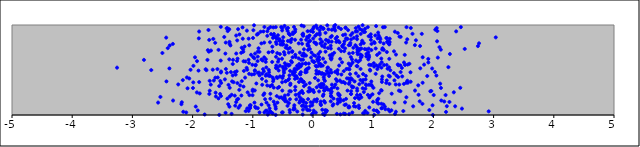
| Category | points |
|---|---|
| 0.7105808632542185 | 0.966 |
| 2.2096744670275097 | 0.034 |
| 0.8415705962671867 | 0.922 |
| 0.407575068377791 | 0.127 |
| 0.1228081273992725 | 0.796 |
| 2.0736347849311088 | 0.638 |
| -0.5068877766610775 | 0.411 |
| -0.4985774278265369 | 0.821 |
| 0.44746918099802 | 0.183 |
| -2.808056882615082 | 0.613 |
| -1.048196033948357 | 0.103 |
| -0.297892421039716 | 0.926 |
| 0.06457462356183985 | 0.898 |
| 2.1230010343279275 | 0.726 |
| -0.9945306396990601 | 0.643 |
| 0.12814866126633806 | 0.979 |
| 0.6297166063317885 | 0.408 |
| -0.5497564237603756 | 0.428 |
| -0.4294087979343857 | 0.148 |
| -0.9731424836548541 | 0.63 |
| -1.2241000954857322 | 0.279 |
| 0.8741937935506154 | 0.395 |
| 0.5419325343704067 | 0.97 |
| -0.6068019779133884 | 0.789 |
| -1.2372229060851998 | 0.081 |
| 1.5678409285535473 | 0.381 |
| 0.7554223387812264 | 0.982 |
| 0.12038748257253218 | 0.702 |
| 0.21489755094719953 | 0.835 |
| 2.757998663448886 | 0.796 |
| -0.45541394580504946 | 0.55 |
| -0.9628500671047702 | 0.682 |
| -0.8239742672561556 | 0.222 |
| -1.539231722912354 | 0.378 |
| -1.319562399824643 | 0.365 |
| 0.20331742074876935 | 0.585 |
| -0.658912145064475 | 0.882 |
| 0.7822898753321175 | 0.731 |
| 0.6819714468313283 | 0.133 |
| 2.054527766417177 | 0.966 |
| -0.7742593381208573 | 0.452 |
| -0.5285851522845935 | 0.196 |
| 0.572870187432553 | 0.845 |
| 1.0991821196682956 | 0.242 |
| -0.11249477900595117 | 0.836 |
| -0.45435411380895374 | 0.377 |
| -1.7159726756758262 | 0.38 |
| -1.4556738507315252 | 0.682 |
| -2.686668835990161 | 0.499 |
| -0.36947547169349537 | 0.809 |
| 0.07771573484048222 | 0.598 |
| -1.4312884535078876 | 0.469 |
| 2.739468916265265 | 0.765 |
| 0.31039236066081966 | 0.815 |
| 0.040040816694386194 | 0.656 |
| -0.09696543576297856 | 0.867 |
| -0.681502159267275 | 0.333 |
| 1.057466917246776 | 0.048 |
| -1.881143054977609 | 0.24 |
| 1.0843748063808034 | 0.03 |
| -0.48463494457880696 | 0.49 |
| 0.8865273041192943 | 0.331 |
| -0.4118252182353075 | 0.227 |
| 1.7099061604410952 | 0.83 |
| 1.0093698911087277 | 0.054 |
| 1.8221788910680505 | 0.641 |
| -1.0184063009123268 | 0.45 |
| -0.18457458651053926 | 0.267 |
| -0.5126539298469117 | 0.94 |
| -1.0474452097846498 | 0.075 |
| 0.7337658028655065 | 0.269 |
| -0.822921130110287 | 0.928 |
| 0.15382430478275744 | 0.464 |
| -0.3822086203293633 | 0.175 |
| 0.10123614058880026 | 0.262 |
| -0.6647660679820468 | 0.858 |
| 0.11236196335986737 | 0.892 |
| -0.43707405122674725 | 0.96 |
| -1.9284061512206012 | 0.251 |
| 0.29361547471216554 | 0.771 |
| 0.6588177998740896 | 0.583 |
| -0.17680733375787838 | 0.372 |
| 1.6523976967900884 | 0.902 |
| 0.8678221013794234 | 0.046 |
| -1.363745131028545 | 0.476 |
| 0.059534277338482156 | 0.151 |
| 0.22566785664970812 | 0.049 |
| -0.7853294539065621 | 0.589 |
| 0.41792314980626344 | 0.238 |
| -1.3330364546751845 | 0.44 |
| 0.5998872591558193 | 0.01 |
| 1.2652192908034259 | 0.79 |
| 1.4764671549466062 | 0.523 |
| -0.590365458336616 | 0.527 |
| -0.42201337102038927 | 0.934 |
| 0.42476716648593804 | 0.973 |
| -0.9129970429125072 | 0.903 |
| -0.061012871594633644 | 0.301 |
| -0.06862385595912635 | 0.814 |
| -0.7403556130976225 | 0.437 |
| -1.5323936813954742 | 0.605 |
| 0.4645892882494067 | 0.955 |
| 0.8236493422986744 | 0.362 |
| -0.6033711161183977 | 0.421 |
| 0.6175103957569341 | 0.778 |
| 1.248639141951971 | 0.817 |
| 1.0745891104235437 | 0.851 |
| 0.46797094988591414 | 0.709 |
| -1.5566352381286706 | 0.001 |
| -0.17493236087110642 | 0.568 |
| -0.2939239040033863 | 0.313 |
| 1.5535628914384159 | 0.976 |
| 0.870275262712453 | 0.293 |
| 0.5410844673982753 | 0.968 |
| -0.590695514644695 | 0.411 |
| 0.18773369565356912 | 0.271 |
| -0.7086245188123321 | 0.181 |
| -1.2446019502264907 | 0.953 |
| -1.3844428528006913 | 0.789 |
| 0.9974011066910595 | 0.147 |
| 0.1111427862533656 | 0.91 |
| 1.9328668452237352 | 0.055 |
| 0.8235721554840749 | 0.998 |
| -1.5425940614056808 | 0.234 |
| -0.9667754567801472 | 0.273 |
| 0.44109499144592057 | 0.806 |
| -0.157670575814703 | 0.144 |
| -0.48220025825955926 | 0.698 |
| -0.08891032440981839 | 0.931 |
| 2.474382716192027 | 0.071 |
| 0.2449414201134834 | 0.283 |
| -0.4177932840524079 | 0.736 |
| -0.09078664868065545 | 0.789 |
| -0.7140807739248647 | 0.435 |
| 1.5006666111850482 | 0.044 |
| 0.3023668775826023 | 0.618 |
| 0.7883252648431229 | 0.673 |
| 0.546903067037122 | 0.849 |
| -0.8374014221623263 | 0.605 |
| -0.032191361618910896 | 0.638 |
| -0.6580996965406607 | 0.973 |
| -0.052448687161949614 | 0.734 |
| -0.15626839020433891 | 0.684 |
| 2.065441943904908 | 0.933 |
| -0.07611563943256616 | 0.861 |
| 0.7311617540089088 | 0.223 |
| -0.6135633507591782 | 0.811 |
| 0.5561196086501319 | 0.511 |
| -0.8563289574069985 | 0.617 |
| 0.014604038165694888 | 0.254 |
| -1.5314986475289531 | 0.979 |
| 0.18371427590360057 | 0.453 |
| 0.48636167755235427 | 0.769 |
| 1.0839396381877817 | 0.18 |
| 1.0611503391977788 | 0.045 |
| 0.20434169768797528 | 0.452 |
| -0.41529239088869296 | 0.967 |
| -0.0557465021584882 | 0.054 |
| 0.5914329515735304 | 0.084 |
| -0.29394954037426846 | 0.95 |
| -1.0452994855732252 | 0.077 |
| -1.0701240603360729 | 0.045 |
| 0.8648762511030466 | 0.959 |
| -0.23867357929119049 | 0.233 |
| -0.3840256376661957 | 0.029 |
| 0.7359435699619858 | 0.696 |
| 0.2928060712687808 | 0.865 |
| -0.7700820077706485 | 0.047 |
| 0.12601823555228098 | 0.123 |
| 0.6710648367866145 | 0.31 |
| 0.3767131658665015 | 0.85 |
| 2.031782747460186 | 0.948 |
| -1.3709513542859213 | 0.773 |
| 0.6030349446683028 | 0.086 |
| 0.4406095367805918 | 0.219 |
| -0.2681427183255245 | 0.511 |
| 0.9249513834595477 | 0.876 |
| -0.6712953740814989 | 0.417 |
| 1.3026693301200352 | 0.052 |
| -0.37453821635521756 | 0.349 |
| 0.3385238035673508 | 0.12 |
| -0.960916958511925 | 0.092 |
| -0.9048740448623214 | 0.741 |
| -0.1790546698259714 | 0.662 |
| -1.7832556350550046 | 0.509 |
| -0.5543253508487656 | 0.842 |
| -0.5902485445855641 | 0.138 |
| 0.6287245256002612 | 0.643 |
| 1.3785708790452977 | 0.672 |
| -0.19762303346581955 | 0.837 |
| 0.266817716065173 | 0.433 |
| 0.23707687342155292 | 0.996 |
| 0.4515812259767058 | 0.624 |
| 0.35133443457884717 | 0.986 |
| 0.7506376507841042 | 0.59 |
| 0.8024535209808938 | 0.738 |
| 0.18724473672402908 | 0.272 |
| -1.3838653841638227 | 0.302 |
| 0.9188500303140597 | 0.618 |
| 0.6479723122208725 | 0.617 |
| -0.16546728112164022 | 0.615 |
| 0.12865818600790924 | 0.324 |
| 0.2526726199776954 | 0.828 |
| 0.9325690137034872 | 0.558 |
| 1.009615945182409 | 0.575 |
| 1.528405149746602 | 0.556 |
| -0.30339612238599134 | 0.514 |
| 1.2572992195871997 | 0.437 |
| -0.9521464459386193 | 0.558 |
| -1.328105998304121 | 0.613 |
| -1.9262924028035089 | 0.598 |
| 1.1758622960423235 | 0.724 |
| 0.7677091687741511 | 0.18 |
| 1.436780920589361 | 0.871 |
| 0.48201739065631344 | 0.585 |
| -0.0705375525738905 | 0.524 |
| -0.7959438279697411 | 0.175 |
| -0.14975825091224237 | 0.32 |
| -1.7297305477454747 | 0.704 |
| -0.5098159356422638 | 0.815 |
| -0.10712666755873901 | 0.477 |
| -2.3280598380997253 | 0.79 |
| -1.8913997171328498 | 0.928 |
| -1.421499400559683 | 0.965 |
| -0.8972645830437118 | 0.471 |
| -1.2677495062357993 | 0.485 |
| -0.760358901971693 | 0.328 |
| 0.19959405980492306 | 0.139 |
| 1.5743529356195376 | 0.358 |
| -0.8579964468806232 | 0.795 |
| 2.0612836570424715 | 0.819 |
| 0.7128509330437076 | 0.463 |
| -0.1594532043080159 | 0.106 |
| -0.09861221442947432 | 0.061 |
| 0.8317267446578498 | 0.019 |
| 0.5125116473228042 | 0.788 |
| -0.0460053377169114 | 0.099 |
| -1.382206374538539 | 0.206 |
| -0.3144339766119737 | 0.084 |
| -1.5271666415011698 | 0.483 |
| 0.42368844495454017 | 0.822 |
| -0.9501872040017734 | 0.079 |
| 0.25742430356094115 | 0.811 |
| -0.8160976537895426 | 0.485 |
| 1.5283867881833526 | 0.141 |
| -0.5013897383651162 | 0.534 |
| -0.012555098561436218 | 0.108 |
| -0.931319061376465 | 0.893 |
| -0.26053890352244125 | 0.409 |
| 0.22923098196198488 | 0.047 |
| -0.9795517286709332 | 0.996 |
| 0.8172890158924657 | 0.825 |
| -0.9771736527837191 | 0.454 |
| -1.1579316780173983 | 0.703 |
| 0.36860199114222336 | 0.939 |
| -0.7434789963696611 | 0.018 |
| -0.0908948186433145 | 0.511 |
| -0.22477356598295373 | 0.539 |
| -0.513215154926745 | 0.782 |
| -0.17325360504993448 | 0.897 |
| -1.0021398286024397 | 0.266 |
| 0.24105910176876755 | 0.525 |
| -0.8474640974606666 | 0.402 |
| 0.43417776020213594 | 0.549 |
| 0.7074806356251271 | 0.093 |
| 1.1942435791065629 | 0.093 |
| -1.3515211384621617 | 0.225 |
| -1.0700755854777562 | 0.613 |
| 1.0665448195316864 | 0.165 |
| 0.08507465728645247 | 0.385 |
| -0.5022647419930832 | 0.029 |
| -1.7233990279702205 | 0.834 |
| -1.5291031461478353 | 0.472 |
| 0.5930350860003788 | 0.571 |
| -1.2533054560312644 | 0.626 |
| 1.1371920545838874 | 0.075 |
| -0.7386256767580752 | 0.696 |
| -1.3003872715403215 | 0.476 |
| 0.9257087269373185 | 0.737 |
| 0.1023947023144558 | 0.643 |
| -0.07925333192066564 | 0.262 |
| -0.12107720432515023 | 0.574 |
| 1.110441633370204 | 0.861 |
| -2.1063867009436517 | 0.028 |
| -0.6758936626560255 | 0.703 |
| -0.16080423420575585 | 0.37 |
| -0.8297154889982528 | 0.509 |
| -1.960102261274523 | 0.641 |
| -0.04632054063599611 | 0.824 |
| 2.2661037539045203 | 0.145 |
| 0.11103764077694578 | 0.941 |
| 0.5889573877732648 | 0.513 |
| -0.6259736678852894 | 0.868 |
| -0.17098401034150967 | 0.005 |
| 1.9487780407493327 | 0.263 |
| 1.6639181404191392 | 0.096 |
| 1.1369435271689543 | 0.526 |
| -0.06959507844679713 | 0.572 |
| 0.02183114832526023 | 0.807 |
| -0.010470592186574201 | 0.601 |
| 1.230618109049452 | 0.813 |
| -0.9178746247529403 | 0.648 |
| -0.6777973174408096 | 0.589 |
| -1.7220352391741391 | 0.234 |
| 1.149185946530273 | 0.078 |
| 1.0647944650137537 | 0.668 |
| -0.16311783585465633 | 0.88 |
| 0.6335393455974172 | 0.264 |
| 0.5235216141220418 | 0.818 |
| 0.03320843801033835 | 0.412 |
| 1.091145977580675 | 0.884 |
| -1.2987601791540433 | 0.215 |
| -0.8552949077144643 | 0.116 |
| 0.7295939586927132 | 0.752 |
| 0.7327259441789433 | 0.294 |
| 0.0034147024176887086 | 0.85 |
| 1.9902207908075464 | 0.001 |
| 0.7430133426907899 | 0.675 |
| -0.3906352577944654 | 0.265 |
| -0.2612476367546277 | 0.038 |
| 0.5341951665120224 | 0.012 |
| 0.5107146730008996 | 0.487 |
| 0.1328022418389141 | 0.46 |
| 0.32145430907277905 | 0.663 |
| -0.10894915084670309 | 0.508 |
| 0.1220552874569858 | 0.842 |
| 1.376844903494555 | 0.036 |
| -0.7340989845775203 | 0.501 |
| -0.38127523331808355 | 0.491 |
| 0.3520354476243881 | 0.691 |
| -0.4392691604773926 | 0.772 |
| -0.0876540020655785 | 0.054 |
| 0.015770638266648263 | 0.59 |
| -0.8109486587940244 | 0.804 |
| 0.45490940454174034 | 0.007 |
| 0.0028205245221730735 | 0.277 |
| 0.17704517425927424 | 0.3 |
| 0.2998746703603512 | 0.212 |
| -1.1897216181845751 | 0.216 |
| 0.8153454311979322 | 0.806 |
| 0.5641552621069001 | 0.407 |
| -0.9546919830673408 | 0.55 |
| -0.9640166760772599 | 0.494 |
| 0.17812990096020442 | 0.42 |
| -2.5347407799600377 | 0.201 |
| -0.4896875110543357 | 0.515 |
| -0.6527275780733905 | 0.149 |
| 0.5621725048040211 | 0.849 |
| -0.662826290802446 | 0.374 |
| 0.9663787288064078 | 0.337 |
| -0.5062611391483385 | 0.813 |
| 0.03806141818568243 | 0.88 |
| 0.2928093334041497 | 0.499 |
| 0.06648057834302712 | 0.175 |
| -1.097934753307932 | 0.937 |
| 0.5492503367039756 | 0.179 |
| 1.1923483928499587 | 0.977 |
| 0.6050627107056998 | 0.36 |
| -1.0293989067913625 | 0.669 |
| 0.3541502293402701 | 0.953 |
| 2.2227080795985366 | 0.098 |
| 1.2255448952033614 | 0.384 |
| -0.0019333901727947023 | 0.141 |
| 0.16915177532483394 | 0.962 |
| -0.6199366913251403 | 0.001 |
| 1.4524598410827059 | 0.264 |
| 1.1504575929338952 | 0.427 |
| -0.9204997972835018 | 0.599 |
| -0.27389727515268536 | 0.431 |
| 0.7548710855670606 | 0.708 |
| -0.3015412269171529 | 0.436 |
| -0.08890791016328059 | 0.773 |
| -0.2995677764238014 | 0.476 |
| 1.8455976806622143 | 0.56 |
| -0.36776493501014684 | 0.263 |
| 1.0346023167559988 | 0.884 |
| -0.16861347192049259 | 0.374 |
| -0.5534728397575224 | 0.829 |
| -0.23663888540645583 | 0.796 |
| 0.9552170008970098 | 0.213 |
| 1.5239483540525205 | 0.668 |
| -0.5149263611209385 | 0.028 |
| -0.7299717849367608 | 0.474 |
| 1.3436181398648621 | 0.465 |
| -0.870427970112301 | 0.925 |
| -0.2006785421689541 | 0.542 |
| -1.4631431390650862 | 0.396 |
| 0.39635336007921573 | 0.013 |
| 0.5071175732737654 | 0.366 |
| -1.5260678612842424 | 0.355 |
| 1.134092541695189 | 0.627 |
| 1.223284183837949 | 0.556 |
| 0.04782550082259185 | 0.027 |
| 0.8036630087734764 | 0.644 |
| -1.2102598050883948 | 0.328 |
| 0.27749919092137443 | 0.276 |
| 1.277258451671524 | 0.428 |
| -2.084089259479716 | 0.297 |
| -2.055769970393393 | 0.406 |
| 1.6241952463337501 | 0.967 |
| -0.7519390773967727 | 0.005 |
| 0.10276801987623063 | 0.571 |
| -0.4215393798119518 | 0.56 |
| -0.203236049927229 | 0.16 |
| 1.2745546342504497 | 0.848 |
| -1.1704396831338304 | 0.974 |
| 0.8337434680290992 | 0.389 |
| 0.7471330193246937 | 0.194 |
| -0.5815974829275836 | 0.886 |
| -0.30008731960232726 | 0.402 |
| -0.17091036339165022 | 0.891 |
| -2.4343352619166914 | 0.373 |
| -0.8067890551043035 | 0.978 |
| 0.16529487549100352 | 0.212 |
| -1.7468609941657487 | 0.72 |
| -0.8896157446037334 | 0.701 |
| 1.6946810310493943 | 0.272 |
| 1.1318528445961222 | 0.276 |
| -2.324578723039514 | 0.161 |
| -1.0933099518867717 | 0.503 |
| 0.7253345462571357 | 0.545 |
| -0.19491523121651078 | 0.18 |
| 0.2570932097951504 | 0.816 |
| -0.5702242150422085 | 0.495 |
| -0.21828287808703806 | 0.693 |
| -1.004026771842974 | 0.22 |
| -1.058920854471026 | 0.775 |
| -2.0339981901767015 | 0.502 |
| 0.061285300688252775 | 0.308 |
| 0.10170889879266642 | 0.611 |
| -0.5144827830469643 | 0.626 |
| -1.3882786965531473 | 0.092 |
| -0.6202239867873729 | 0.863 |
| -1.1280047625992369 | 0.416 |
| -0.5814604580676939 | 0.592 |
| 0.056098816734791335 | 0.492 |
| 0.7828286356816161 | 0.609 |
| 0.5329069610143291 | 0.74 |
| -0.7715136337742585 | 0.137 |
| -0.04215884089411048 | 0.285 |
| -1.647338428187659 | 0.383 |
| 1.081920274142746 | 0.915 |
| 0.19235857625931896 | 0.754 |
| -0.9726602217579927 | 0.137 |
| -3.2552146485573052 | 0.526 |
| -0.3079023404833965 | 0.5 |
| -1.1360599311580053 | 0.761 |
| -1.408580639215744 | 0.12 |
| 1.821144787063071 | 0.358 |
| -0.5497171507210927 | 0.548 |
| 0.4473618271854276 | 0.383 |
| 0.8426130117652395 | 0.799 |
| -1.5700707651537176 | 0.184 |
| 1.2173998304040339 | 0.356 |
| 0.3267308266745452 | 0.105 |
| 0.36849164212187535 | 0.479 |
| -1.4031938509805766 | 0.335 |
| 0.7937429401468137 | 0.64 |
| 0.7374437993625262 | 0.542 |
| 0.4096067122627014 | 0.173 |
| 1.6005360739348884 | 0.569 |
| -0.07191235099093607 | 0.767 |
| -1.192687041610057 | 0.691 |
| 1.354647637735921 | 0.137 |
| -0.1148155551823633 | 0.135 |
| 1.069316577235064 | 0.51 |
| 1.2657893499905652 | 0.785 |
| -1.473910430754148 | 0.867 |
| 0.5473283626578791 | 0.116 |
| 0.9181708306740131 | 0.696 |
| -0.4885776546916123 | 0.175 |
| -0.47102223107664365 | 0.672 |
| -0.34616700703433345 | 0.702 |
| 0.052043671174820005 | 0.993 |
| -0.7126671983744419 | 0.04 |
| -0.9662504211062863 | 0.494 |
| 0.714592180907256 | 0.605 |
| -0.614217852651822 | 0.647 |
| -0.23724646927272275 | 0.524 |
| 0.7343355941005871 | 0.929 |
| 0.8319059365979475 | 0.455 |
| -0.1603744579466202 | 0.165 |
| 0.6768820780214835 | 0.857 |
| 1.0035759909044977 | 0.302 |
| 1.141292342971183 | 0.586 |
| 0.49948934011063084 | 0.887 |
| -1.2756656892845966 | 0.144 |
| 0.16621205907050385 | 0.344 |
| 0.6555856985134554 | 0.91 |
| 0.5334243783707553 | 0.353 |
| 0.9637217581190249 | 0.556 |
| 0.20919234060608183 | 0.049 |
| -0.31583814927905696 | 0.979 |
| 0.3699403365734817 | 0.999 |
| 0.4266567427631207 | 0.23 |
| -0.2181256991798195 | 0.458 |
| -0.9204921525653953 | 0.468 |
| -0.5709523781436481 | 0.619 |
| -0.27739336421260496 | 0.174 |
| 1.9789260904515142 | 0.516 |
| -1.6945738850087286 | 0.716 |
| 0.8444376927224697 | 0.255 |
| 0.15457897003652388 | 0.058 |
| 0.5055940144368343 | 0.164 |
| 0.9593834565959165 | 0.897 |
| 0.7300091021406736 | 0.874 |
| -1.6559461731510385 | 0.845 |
| 0.7536788025549583 | 0.432 |
| 0.9101724655997465 | 0.976 |
| 0.15059928989766647 | 0.77 |
| 1.014037967818945 | 0.539 |
| -0.26500166003314884 | 0.547 |
| -0.4145877433760834 | 0.387 |
| -0.5866037820830625 | 0.301 |
| 0.4220598101801736 | 0.145 |
| 0.652633476389056 | 0.028 |
| 0.20080273381938696 | 0.786 |
| -2.1626972728773772 | 0.388 |
| 1.1705618536662428 | 0.117 |
| 1.781709609012129 | 0.519 |
| -1.148485716884771 | 0.49 |
| 0.0026014089254804418 | 0.022 |
| -0.6110789143828317 | 0.55 |
| 0.3163273849596111 | 0.675 |
| 0.9880166736146592 | 0.23 |
| 0.8776529139544405 | 0.435 |
| 0.6190196795983365 | 0.39 |
| -0.2155192541515003 | 0.248 |
| 0.8636272407331989 | 0.924 |
| 0.31022397396549994 | 0.26 |
| 0.9718240546708836 | 0.79 |
| -0.018582932001882213 | 0.007 |
| -0.1536770570256003 | 0.986 |
| 0.9045267654593427 | 0.022 |
| -0.4966951297533173 | 0.182 |
| 0.6708321151520922 | 0.747 |
| -0.7833029241681597 | 0.619 |
| -0.31896369326227436 | 0.467 |
| 0.9703341124959417 | 0.722 |
| 0.1346533709335933 | 0.311 |
| -0.6188439016451817 | 0.976 |
| -0.4229555277429924 | 0.102 |
| -0.3780065629770526 | 0.333 |
| -0.1833006828846786 | 0.102 |
| -0.12742332060069472 | 0.474 |
| 1.2693196909323596 | 0.345 |
| -0.05739833769214897 | 0.884 |
| 0.5101540690450799 | 0.016 |
| -0.9170220274238519 | 0.076 |
| -0.46337223464217114 | 0.175 |
| 0.10497620832303411 | 0.332 |
| -1.0460090393890429 | 0.106 |
| 2.101368534605289 | 0.754 |
| 2.049832947746726 | 0.438 |
| -1.3451683243483554 | 0.373 |
| 0.42930649606974747 | 0.736 |
| 0.08983648461564364 | 0.677 |
| -0.03896190519227982 | 0.142 |
| 1.155069526706213 | 0.742 |
| 0.010998658611438117 | 0.589 |
| 0.6973790845960792 | 0.188 |
| -2.185883387342333 | 0.12 |
| -1.4475713120465592 | 0.511 |
| 0.7673645027163927 | 0.732 |
| 0.759161317687024 | 0.725 |
| 1.3843356150926702 | 0.439 |
| 0.9619488378739378 | 0.835 |
| -0.08161243901900317 | 0.177 |
| 0.025802741014794073 | 0.169 |
| 0.16888572364106835 | 0.012 |
| -0.6944846263491185 | 0.03 |
| 1.8172103020820876 | 0.124 |
| 0.23068078035217265 | 0.491 |
| -1.1229674221012491 | 0.595 |
| -0.8080117714424073 | 0.029 |
| -0.40030327363532425 | 0.131 |
| 1.01557695408788 | 0.81 |
| -0.5274896941282048 | 0.977 |
| 2.0046359093680746 | 0.222 |
| -0.7082558955367819 | 0.236 |
| 1.4324425126266673 | 0.338 |
| 0.19801396346266031 | 0.379 |
| -0.9905499413471999 | 0.942 |
| 0.5254334582060656 | 0.112 |
| 1.0419076242785543 | 0.739 |
| -0.3381249360963414 | 0.454 |
| 1.9156027660077841 | 0.584 |
| 1.3606156403110443 | 0.926 |
| 1.408356402001223 | 0.561 |
| -1.769902550837374 | 0.498 |
| 0.5184024461952967 | 0.709 |
| -0.9961371625794948 | 0.856 |
| 0.134011948427335 | 0.975 |
| -0.6104332550709302 | 0.853 |
| -0.40608959168587866 | 0.548 |
| -0.3965900738398549 | 0.402 |
| 0.15282238578133622 | 0.814 |
| 0.9791599142630556 | 0.325 |
| 0.04791482983044304 | 0.799 |
| 0.8779462297727294 | 0.339 |
| -0.7229867387233755 | 0.437 |
| -0.119624764904815 | 0.498 |
| 0.7051365200091588 | 0.775 |
| -0.8086109272758772 | 0.239 |
| -2.3796892005320025 | 0.773 |
| 2.180082290973763 | 0.15 |
| 0.20203888036941287 | 0.052 |
| -0.4720212506722792 | 0.195 |
| 1.8069631345169004 | 0.901 |
| -0.5103919948723679 | 0.967 |
| -1.0626934772755154 | 0.579 |
| 1.202273619027312 | 0.064 |
| -0.7854518640701524 | 0.437 |
| 0.3075639445587752 | 0.471 |
| 0.184450540436357 | 0.154 |
| -0.38621737910458265 | 0.744 |
| -1.0926261735386769 | 0.073 |
| -1.5285689527040507 | 0.21 |
| -1.587643263439392 | 0.51 |
| -1.993929026751327 | 0.3 |
| 2.125693433715602 | 0.301 |
| -1.1535088066397075 | 0.597 |
| -0.777870088134601 | 0.375 |
| -2.239151980448223 | 0.34 |
| -1.255332720962195 | 0.354 |
| 0.12476069037503112 | 0.566 |
| -1.0359739322548656 | 0.108 |
| 2.1307184076382164 | 0.161 |
| 1.6222641593699274 | 0.37 |
| 0.858744866493697 | 0.733 |
| -0.3919514974473106 | 0.44 |
| 0.9111533775082217 | 0.223 |
| 1.1490495502417293 | 0.727 |
| 0.35153154472371373 | 0.31 |
| -1.0858203002208597 | 0.252 |
| 1.48192999685316 | 0.429 |
| -1.2844832637416683 | 0.448 |
| 0.127938521568435 | 0.31 |
| 1.7533919897657304 | 0.225 |
| -0.22812038017259173 | 0.568 |
| 1.8978436205560403 | 0.433 |
| 0.9499850874803837 | 0.493 |
| 1.5514091587599355 | 0.197 |
| 0.5728665555051977 | 0.271 |
| -0.8108517236117221 | 0.64 |
| 0.7380696988100386 | 0.726 |
| -0.5403768908137287 | 0.784 |
| -0.3875932904060635 | 0.055 |
| -0.38195888416155555 | 0.889 |
| -1.0691398200002356 | 0.848 |
| -0.6715964919530784 | 0.704 |
| -0.18719464161029542 | 0.16 |
| 3.0360410195235055 | 0.862 |
| -0.04049304171425572 | 0.27 |
| -0.18080282049586582 | 0.792 |
| -0.14814988060068313 | 0.672 |
| 0.8183011615241957 | 0.941 |
| 0.7883470517201037 | 0.389 |
| -0.8876212338972245 | 0.029 |
| 0.05911181319789005 | 0.538 |
| 0.29419790066213203 | 0.631 |
| -0.19701439383934538 | 0.613 |
| 0.49235147815033375 | 0.757 |
| 1.2673397955760093 | 0.624 |
| -1.1664803593318842 | 0.848 |
| 0.9306680798300118 | 0.336 |
| 0.6330011855857585 | 0.84 |
| 1.7480575964257827 | 0.329 |
| 0.12880459379930365 | 0.149 |
| 0.9449427035353661 | 0.503 |
| -0.713351421580974 | 0.32 |
| -0.32387087008696547 | 0.062 |
| -0.7409558012846436 | 0.96 |
| 1.5462490753432183 | 0.805 |
| 1.2642465061738397 | 0.529 |
| -0.5048586673793283 | 0.785 |
| 0.17412954979677142 | 0.958 |
| 1.5712335834552533 | 0.56 |
| 1.1113307168634572 | 0.561 |
| 1.226731668865913 | 0.699 |
| -0.9410290072246239 | 0.35 |
| 0.3407623800689672 | 0.183 |
| 0.1746616716223217 | 0.228 |
| 0.40708584827001815 | 0.499 |
| 0.6347477061613951 | 0.565 |
| -0.7583232226008052 | 0.93 |
| 0.4099335086941398 | 0.458 |
| -1.2923697093950288 | 0.104 |
| -0.4920598434963521 | 0.786 |
| -1.8964325396100623 | 0.851 |
| -1.44882896525277 | 0.805 |
| 1.144279994745169 | 0.367 |
| 0.9315485361665452 | 0.647 |
| -1.117707328015066 | 0.043 |
| -0.06378172426145934 | 0.263 |
| -1.2620097222948283 | 0.171 |
| 1.1189299427350399 | 0.843 |
| -1.2754164975395383 | 0.683 |
| -1.9860655423334777 | 0.546 |
| 0.24947029699332024 | 0.467 |
| 0.055295846233466506 | 0.459 |
| 0.38834114387342566 | 0.812 |
| 0.19106643605893847 | 0.001 |
| 1.5656291144864474 | 0.841 |
| -1.5579570682114454 | 0.321 |
| -0.9165936441616509 | 0.704 |
| -1.2766782596076522 | 0.883 |
| -0.47271037930775606 | 0.99 |
| 1.4272553731384887 | 0.271 |
| -1.3874304790404768 | 0.813 |
| 0.6261782735436308 | 0.888 |
| 0.13902423819655318 | 0.346 |
| 0.6058444265094485 | 0.507 |
| -0.5585752544306093 | 0.193 |
| 0.8111469690852475 | 0.661 |
| 0.31190759514412303 | 0.947 |
| 0.1325904900011956 | 0.11 |
| -0.8439675120590753 | 0.46 |
| -0.5497116233916275 | 0.677 |
| -0.36337829477040895 | 0.599 |
| 1.0646071660576801 | 0.14 |
| -0.3100530587748169 | 0.108 |
| 1.220229885579653 | 0.856 |
| -0.7369659764079506 | 0.107 |
| 1.4079321023101494 | 0.911 |
| -1.5692949101159739 | 0.723 |
| 2.2490574060877027 | 0.532 |
| 0.01720250042915339 | 0.593 |
| 0.6339520527184144 | 0.233 |
| -0.2319921498432782 | 0.367 |
| 0.7922329370580687 | 0.901 |
| -2.3853722181635657 | 0.517 |
| -0.19668254068823465 | 0.396 |
| -0.4678620917391436 | 0.216 |
| 1.2386352009675798 | 0.515 |
| 0.2558362810087704 | 0.951 |
| 1.1737500060465003 | 0.794 |
| 2.4560124848713816 | 0.976 |
| 0.710167642205846 | 0.928 |
| 0.3981146910018909 | 0.478 |
| 1.4563555782380684 | 0.868 |
| 0.08804075175782877 | 0.46 |
| 1.2436321569742832 | 0.807 |
| -0.7150354309505111 | 0.808 |
| 0.08892841243391914 | 0.635 |
| 1.511710466945976 | 0.583 |
| 0.43784882400301584 | 0.221 |
| 0.10310050719032215 | 0.478 |
| -0.19062131195034127 | 0.994 |
| -0.7161044645579988 | 0.037 |
| 1.1161520223690449 | 0.812 |
| 0.0002987748578977545 | 0.924 |
| -0.12905630820584335 | 0.088 |
| 1.1451551713084047 | 0.395 |
| 0.3120063325669671 | 0.878 |
| 1.2849562892872495 | 0.497 |
| 0.3996143007626589 | 0.867 |
| -1.6174108020839206 | 0.248 |
| 0.27258482726317457 | 0.466 |
| 0.9257328488282841 | 0.636 |
| -0.34449164903865004 | 0.709 |
| -0.45210476250098264 | 0.517 |
| 0.4017149412587733 | 0.376 |
| 1.0858582949947744 | 0.537 |
| -0.15339823364358196 | 0.367 |
| -1.6649105398468942 | 0.503 |
| -0.055221101467346934 | 0.355 |
| -0.49754277053358287 | 0.434 |
| -0.2974204828128535 | 0.836 |
| 1.2236838314174676 | 0.854 |
| -1.4170266067095794 | 0.932 |
| -1.2220500229506497 | 0.895 |
| -0.7759272686986156 | 0.529 |
| 0.3135450877026278 | 0.337 |
| 0.6555932141005476 | 0.307 |
| -0.29377998019331564 | 0.669 |
| -0.5127566279305409 | 0.364 |
| -0.16550861096109504 | 0.904 |
| 1.9653363493192533 | 0.267 |
| -0.720987450933249 | 0.073 |
| 1.0410363480060418 | 0.457 |
| -0.6183709466425871 | 0.07 |
| -1.001260299406888 | 0.281 |
| 1.4152413916546758 | 0.421 |
| -0.1665756877419593 | 0.059 |
| -0.3534367984392546 | 0.845 |
| 1.7727175137016404 | 0.152 |
| -1.9019931631991636 | 0.493 |
| -0.5641737178765647 | 0.311 |
| -0.2008933383351117 | 0.476 |
| 2.3611248243779865 | 0.097 |
| -1.6245549815509808 | 0.802 |
| -0.3339266179405769 | 0.917 |
| 0.300905682835209 | 0.207 |
| -0.025314559594549202 | 0.695 |
| -1.3523275960656003 | 0.012 |
| -0.2262641255828619 | 0.137 |
| 0.5831582047582673 | 0.943 |
| 0.18453304456717756 | 0.395 |
| 1.9153361257342318 | 0.623 |
| 1.1623127900928036 | 0.975 |
| 0.768939788941938 | 0.342 |
| 0.1764463151742266 | 0.333 |
| -0.21260078012482442 | 0.158 |
| -1.1023515770516292 | 0.524 |
| 1.5480201556001347 | 0.359 |
| 1.0165073193048855 | 0.002 |
| 0.45084863152136734 | 0.167 |
| -0.20365033435706703 | 0.397 |
| -0.1674305435052421 | 0.244 |
| 0.09269212128373816 | 0.546 |
| -0.7060231513008697 | 0.977 |
| 0.2235479278575747 | 0.291 |
| 0.2964965104948014 | 0.739 |
| -0.039410339570256525 | 0.933 |
| 1.1803362833625473 | 0.555 |
| 0.3530906733420487 | 0.966 |
| -1.3334197504587681 | 0.567 |
| 0.7818140834332477 | 0.955 |
| -0.30748669008872476 | 0.919 |
| 0.9374022647165434 | 0.194 |
| -1.154420184997587 | 0.316 |
| 0.3990045118576271 | 0.819 |
| -0.11608161629111713 | 0.66 |
| 0.5973331980440468 | 0.095 |
| 1.2726809994384372 | 0.811 |
| -0.4631957686757522 | 0.153 |
| -0.3942209397184335 | 0.9 |
| -2.4390285800703593 | 0.86 |
| -2.5731668083866883 | 0.138 |
| -0.6698359788782291 | 0.017 |
| 0.661874918952849 | 0.69 |
| -1.7996258207881164 | 0.006 |
| 0.38152236713899246 | 0.397 |
| 1.3624608593884204 | 0.011 |
| 0.47131532235041274 | 0.449 |
| -0.3047223900786822 | 0.066 |
| -1.9886664364396838 | 0.362 |
| 1.5088523954713997 | 0.345 |
| 0.888705640871275 | 0.679 |
| -0.3336192928204209 | 0.901 |
| 0.14982373628910484 | 0.458 |
| 0.5948760228774104 | 0.405 |
| -0.8427975875320097 | 0.336 |
| 0.6009027887853478 | 0.683 |
| 1.3527069130225016 | 0.385 |
| -0.6124169854341686 | 0.528 |
| 1.0866986920278068 | 0.126 |
| 0.22241520937248893 | 0.308 |
| -2.4125139445473884 | 0.743 |
| 0.40528520888883257 | 0.296 |
| 0.6793217857979972 | 0.097 |
| -1.060579495610078 | 0.458 |
| -0.4819416083866841 | 0.47 |
| 1.1028111389807052 | 0.689 |
| 0.2502614633623672 | 0.527 |
| 0.5943779223805397 | 0.776 |
| -0.14949569957272324 | 0.658 |
| -1.1835533246149703 | 0.748 |
| -0.6521198224756031 | 0.305 |
| 0.6203419703506503 | 0.8 |
| 0.6157141351207276 | 0.454 |
| -1.7153522485413593 | 0.27 |
| 0.8028708791099932 | 0.196 |
| 2.520395588227288 | 0.734 |
| 0.8255788194562692 | 0.297 |
| -0.7589260542774223 | 0.88 |
| -1.434857294697018 | 0.963 |
| -1.2116204838154703 | 0.105 |
| 2.3779495937782897 | 0.929 |
| -0.2261586698423601 | 0.202 |
| 0.13219618770693042 | 0.545 |
| 0.45119200374218593 | 0.148 |
| 0.6190904844030314 | 0.547 |
| -0.4539786488828703 | 0.749 |
| 0.3716521449895369 | 0.339 |
| 0.9685414524052618 | 0.372 |
| 0.7897158844064016 | 0.512 |
| 2.446766029287975 | 0.302 |
| -1.3908053654881867 | 0.952 |
| -1.4520570857648067 | 0.024 |
| 2.918473330218534 | 0.041 |
| -1.0068901215133037 | 0.558 |
| -0.12078798805189628 | 0.569 |
| -0.6488289381486414 | 0.901 |
| -0.208200212282037 | 0.451 |
| 0.47533735285122347 | 0.365 |
| 0.934422254298422 | 0.084 |
| 0.8909423680467441 | 0.728 |
| 0.011827468535209995 | 0.049 |
| 1.2517593603362913 | 0.061 |
| 2.339371268012595 | 0.252 |
| -0.6965268288366886 | 0.899 |
| -1.8902534111570377 | 0.366 |
| 0.8857068728440911 | 0.65 |
| 0.851419056938151 | 0.019 |
| -0.6023258320217373 | 0.21 |
| -0.5097076976507386 | 0.271 |
| -2.094434918771284 | 0.417 |
| -1.05593384116552 | 0.221 |
| -0.41793046284021695 | 0.822 |
| -0.28854387555631256 | 0.644 |
| -2.1792883494014017 | 0.141 |
| 1.7789667170993138 | 0.766 |
| -0.2957953130974049 | 0.276 |
| -0.5544056260023336 | 0.822 |
| -0.593323754278801 | 0.688 |
| -1.3907220953530635 | 0.618 |
| 0.6910740093904426 | 0.373 |
| -0.7845624278173391 | 0.047 |
| 0.7840342923577177 | 0.224 |
| 2.1122757218353296 | 0.348 |
| -1.913830549678571 | 0.05 |
| -0.5848615004261521 | 0.848 |
| -2.1545068218216317 | 0.036 |
| -1.5825816303113553 | 0.417 |
| -0.6756032040591808 | 0.759 |
| 0.20791000284111583 | 0.913 |
| 1.34577383155185 | 0.707 |
| 0.29678994427780214 | 0.239 |
| 1.023494769809937 | 0.8 |
| -1.1841553657802049 | 0.375 |
| -0.49394703585042254 | 0.864 |
| 0.00867034824314672 | 0.667 |
| 1.051474597103839 | 0.552 |
| 0.2949803184889541 | 0.152 |
| 0.044513585587046656 | 0.548 |
| 0.7648273904038874 | 0.078 |
| 1.4523159465917805 | 0.551 |
| 1.0485335422218416 | 0.988 |
| -1.736478833304492 | 0.945 |
| 0.16146627387299706 | 0.549 |
| -1.6982085730950942 | 0.338 |
| 0.20815407025097432 | 0.703 |
| 1.4207232458906862 | 0.553 |
| 0.42579067419066163 | 0.222 |
| 0.6505827400486801 | 0.395 |
| -1.259506569059483 | 0.829 |
| 1.3747742421614504 | 0.339 |
| -2.501780955498794 | 0.689 |
| 0.308835519929179 | 0.632 |
| 0.5969439704942001 | 0.346 |
| 2.274088574550559 | 0.678 |
| 0.7904224215426181 | 0.784 |
| 0.960715272915257 | 0.866 |
| -0.1496855364273264 | 0.73 |
| 0.9274166224543263 | 0.664 |
| 0.27902671505967724 | 0.663 |
| 0.16686312984543417 | 0.626 |
| -1.7530455987597309 | 0.612 |
| -0.6123867376097012 | 0.52 |
| -0.4567910030600819 | 0.373 |
| -1.4228783793247262 | 0.183 |
| 1.6922091298329214 | 0.776 |
| 0.07198251225460428 | 0.619 |
| -0.4016169746304836 | 0.694 |
| -0.6216734504025858 | 0.092 |
| 0.7601334133426212 | 0.105 |
| 0.7317341645729796 | 0.842 |
| -1.2615723255330904 | 0.6 |
| 0.5349164472322503 | 0.894 |
| -0.08154490345927456 | 0.724 |
| -1.160227391291282 | 0.728 |
| -0.3391884636455744 | 0.641 |
| -0.46774044535825254 | 0.575 |
| -0.6352244561226055 | 0.117 |
| -0.001360713183605533 | 0.957 |
| 0.6303789625657199 | 0.235 |
| -0.8886132057138996 | 0.441 |
| 0.05519332065816407 | 0.786 |
| 1.3073201611299785 | 0.237 |
| 1.4555083741273824 | 0.477 |
| 1.1363466103366076 | 0.125 |
| -1.61305085640865 | 0.206 |
| -0.6558249471106956 | 0.395 |
| 0.6440286619313582 | 0.319 |
| -1.9472109233141808 | 0.094 |
| 0.24866422209707562 | 0.743 |
| 1.1408427625325324 | 0.272 |
| 2.024986030941861 | 0.478 |
| -0.3390532531317687 | 0.476 |
| -0.28731485633110054 | 0.225 |
| 0.2151706680395229 | 0.031 |
| -0.37166184039996875 | 0.83 |
| -0.11320289472721257 | 0.095 |
| -0.23796607457715613 | 0.629 |
| -0.11995483684190411 | 0.338 |
| -0.3493765748671427 | 0.586 |
| 2.2026036565127267 | 0.221 |
| -1.2420822958780455 | 0.179 |
| -1.6220455914168674 | 0.415 |
| 0.3108494879478254 | 0.296 |
| 1.2762032965422092 | 0.04 |
| 1.6194211461429386 | 0.475 |
| 1.985996948848368 | 0.108 |
| 0.0723426211248741 | 0.965 |
| 0.013083019749632108 | 0.977 |
| 0.1646754526025873 | 0.962 |
| -0.38895886735990004 | 0.556 |
| -0.40132327627154396 | 0.904 |